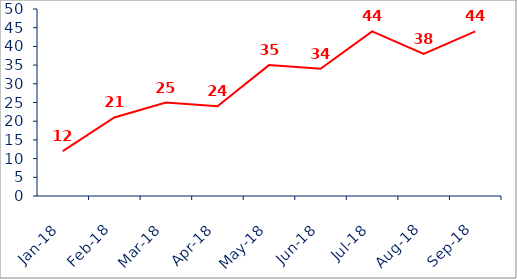
| Category | Chart Data Source |
|---|---|
| 2018-01-01 | 12 |
| 2018-02-01 | 21 |
| 2018-03-01 | 25 |
| 2018-04-01 | 24 |
| 2018-05-01 | 35 |
| 2018-06-01 | 34 |
| 2018-07-01 | 44 |
| 2018-08-01 | 38 |
| 2018-09-01 | 44 |